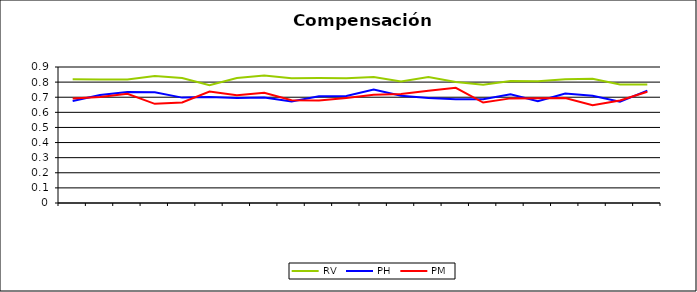
| Category | RV | PH | PM |
|---|---|---|---|
| 0 | 0.819 | 0.675 | 0.691 |
| 1 | 0.818 | 0.714 | 0.701 |
| 2 | 0.817 | 0.734 | 0.722 |
| 3 | 0.84 | 0.732 | 0.656 |
| 4 | 0.827 | 0.697 | 0.666 |
| 5 | 0.78 | 0.701 | 0.737 |
| 6 | 0.827 | 0.695 | 0.713 |
| 7 | 0.844 | 0.699 | 0.73 |
| 8 | 0.826 | 0.672 | 0.68 |
| 9 | 0.827 | 0.706 | 0.678 |
| 10 | 0.826 | 0.709 | 0.696 |
| 11 | 0.834 | 0.751 | 0.717 |
| 12 | 0.804 | 0.709 | 0.721 |
| 13 | 0.834 | 0.694 | 0.743 |
| 14 | 0.802 | 0.687 | 0.763 |
| 15 | 0.783 | 0.687 | 0.665 |
| 16 | 0.807 | 0.72 | 0.692 |
| 17 | 0.805 | 0.674 | 0.693 |
| 18 | 0.82 | 0.724 | 0.695 |
| 19 | 0.822 | 0.71 | 0.646 |
| 20 | 0.784 | 0.67 | 0.678 |
| 21 | 0.785 | 0.743 | 0.736 |